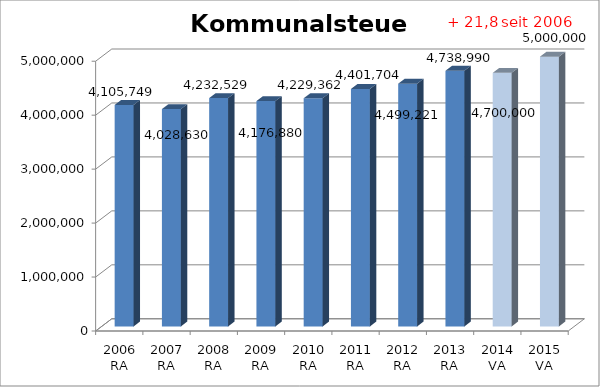
| Category | Kommunalsteuer  |
|---|---|
| 2006 RA | 4105749.05 |
| 2007 RA | 4028629.63 |
| 2008 RA | 4232528.72 |
| 2009 RA | 4176880.04 |
| 2010 RA | 4229361.8 |
| 2011 RA | 4401703.67 |
| 2012 RA | 4499220.74 |
| 2013 RA | 4738989.79 |
| 2014 VA | 4700000 |
| 2015 VA | 5000000 |